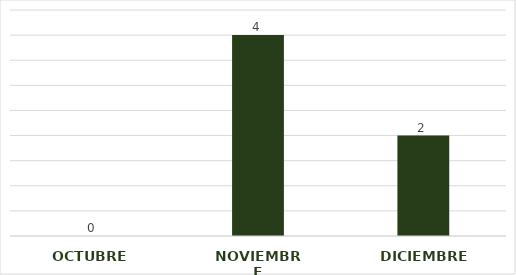
| Category | CANTIDAD |
|---|---|
| OCTUBRE | 0 |
| NOVIEMBRE | 4 |
| DICIEMBRE | 2 |